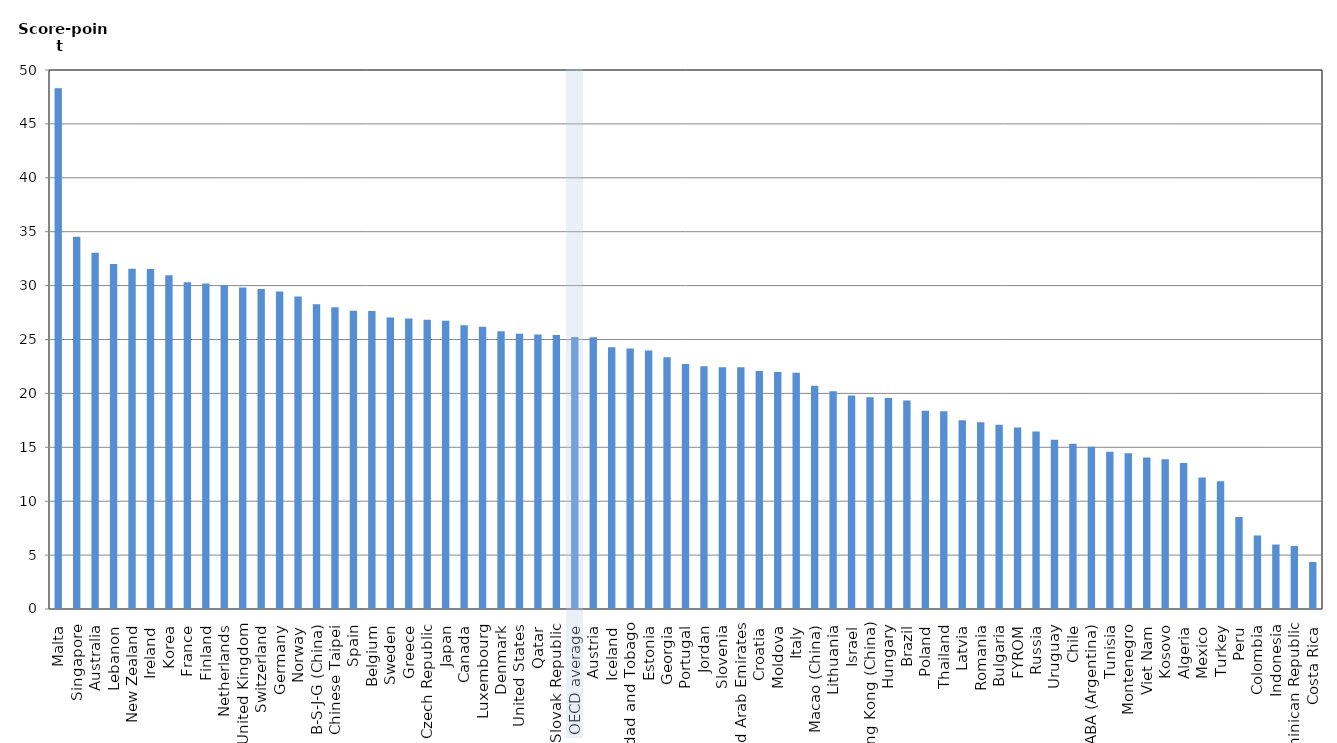
| Category | Average student |
|---|---|
| Malta | 48.311 |
| Singapore | 34.536 |
| Australia | 33.053 |
| Lebanon | 32.006 |
| New Zealand | 31.557 |
| Ireland | 31.543 |
| Korea | 30.961 |
| France | 30.312 |
| Finland | 30.199 |
| Netherlands | 30.064 |
| United Kingdom | 29.834 |
| Switzerland | 29.687 |
| Germany | 29.448 |
| Norway | 28.979 |
| B-S-J-G (China) | 28.262 |
| Chinese Taipei | 27.994 |
| Spain | 27.663 |
| Belgium | 27.648 |
| Sweden | 27.043 |
| Greece | 26.94 |
| Czech Republic | 26.823 |
| Japan | 26.751 |
| Canada | 26.328 |
| Luxembourg | 26.182 |
| Denmark | 25.757 |
| United States | 25.525 |
| Qatar | 25.456 |
| Slovak Republic | 25.421 |
| OECD average | 25.226 |
| Austria | 25.218 |
| Iceland | 24.27 |
| Trinidad and Tobago | 24.17 |
| Estonia | 23.983 |
| Georgia | 23.348 |
| Portugal | 22.73 |
| Jordan | 22.51 |
| Slovenia | 22.432 |
| United Arab Emirates | 22.428 |
| Croatia | 22.074 |
| Moldova | 21.978 |
| Italy | 21.906 |
| Macao (China) | 20.721 |
| Lithuania | 20.207 |
| Israel | 19.798 |
| Hong Kong (China) | 19.632 |
| Hungary | 19.578 |
| Brazil | 19.346 |
| Poland | 18.395 |
| Thailand | 18.335 |
| Latvia | 17.503 |
| Romania | 17.321 |
| Bulgaria | 17.102 |
| FYROM | 16.846 |
| Russia | 16.457 |
| Uruguay | 15.697 |
| Chile | 15.338 |
| CABA (Argentina) | 15.06 |
| Tunisia | 14.582 |
| Montenegro | 14.44 |
| Viet Nam | 14.059 |
| Kosovo | 13.89 |
| Algeria | 13.55 |
| Mexico | 12.188 |
| Turkey | 11.861 |
| Peru | 8.537 |
| Colombia | 6.823 |
| Indonesia | 5.98 |
| Dominican Republic | 5.848 |
| Costa Rica | 4.362 |